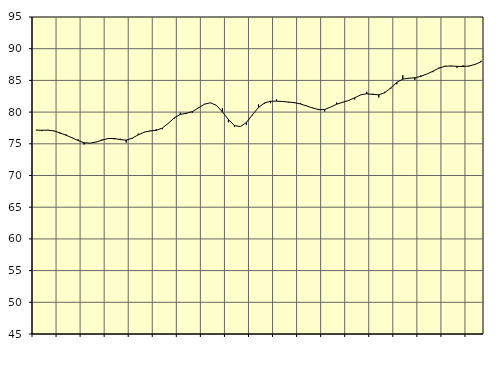
| Category | Piggar | Samtliga sysselsatta (inkl. sysselsatta utomlands) |
|---|---|---|
| nan | 77.2 | 77.16 |
| 1.0 | 77 | 77.13 |
| 1.0 | 77.2 | 77.15 |
| 1.0 | 77 | 77.03 |
| nan | 76.6 | 76.72 |
| 2.0 | 76.5 | 76.35 |
| 2.0 | 76 | 75.95 |
| 2.0 | 75.7 | 75.51 |
| nan | 74.9 | 75.17 |
| 3.0 | 75.1 | 75.1 |
| 3.0 | 75.3 | 75.27 |
| 3.0 | 75.7 | 75.58 |
| nan | 75.9 | 75.83 |
| 4.0 | 75.7 | 75.84 |
| 4.0 | 75.8 | 75.66 |
| 4.0 | 75.2 | 75.58 |
| nan | 75.8 | 75.89 |
| 5.0 | 76.6 | 76.41 |
| 5.0 | 76.8 | 76.84 |
| 5.0 | 77.1 | 77.02 |
| nan | 77.3 | 77.13 |
| 6.0 | 77.3 | 77.48 |
| 6.0 | 78.2 | 78.23 |
| 6.0 | 79 | 79.1 |
| nan | 79.9 | 79.63 |
| 7.0 | 79.7 | 79.82 |
| 7.0 | 79.9 | 80.08 |
| 7.0 | 80.7 | 80.65 |
| nan | 81.3 | 81.24 |
| 8.0 | 81.5 | 81.47 |
| 8.0 | 81.1 | 81.07 |
| 8.0 | 80.6 | 80.04 |
| nan | 78.4 | 78.81 |
| 9.0 | 77.7 | 77.87 |
| 9.0 | 77.7 | 77.72 |
| 9.0 | 78 | 78.37 |
| nan | 79.5 | 79.59 |
| 10.0 | 81.2 | 80.73 |
| 10.0 | 81.3 | 81.44 |
| 10.0 | 81.4 | 81.71 |
| nan | 82 | 81.73 |
| 11.0 | 81.7 | 81.67 |
| 11.0 | 81.5 | 81.58 |
| 11.0 | 81.6 | 81.48 |
| nan | 81.4 | 81.28 |
| 12.0 | 81 | 80.97 |
| 12.0 | 80.7 | 80.65 |
| 12.0 | 80.5 | 80.39 |
| nan | 80.1 | 80.41 |
| 13.0 | 80.8 | 80.79 |
| 13.0 | 81.5 | 81.24 |
| 13.0 | 81.6 | 81.55 |
| nan | 81.9 | 81.83 |
| 14.0 | 82 | 82.26 |
| 14.0 | 82.7 | 82.72 |
| 14.0 | 83.2 | 82.89 |
| nan | 82.9 | 82.79 |
| 15.0 | 82.3 | 82.73 |
| 15.0 | 83.2 | 83.06 |
| 15.0 | 83.7 | 83.82 |
| nan | 84.4 | 84.69 |
| 16.0 | 85.8 | 85.2 |
| 16.0 | 85.3 | 85.35 |
| 16.0 | 85.1 | 85.41 |
| nan | 85.8 | 85.64 |
| 17.0 | 86 | 86 |
| 17.0 | 86.3 | 86.45 |
| 17.0 | 87 | 86.93 |
| nan | 87.3 | 87.23 |
| 18.0 | 87.2 | 87.28 |
| 18.0 | 87 | 87.22 |
| 18.0 | 87.4 | 87.19 |
| nan | 87.2 | 87.27 |
| 19.0 | 87.5 | 87.52 |
| 19.0 | 88.1 | 87.92 |